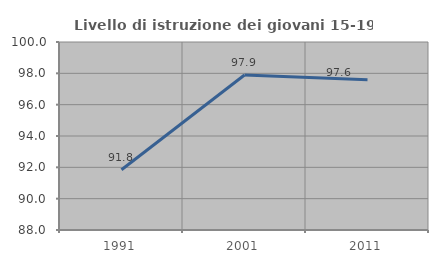
| Category | Livello di istruzione dei giovani 15-19 anni |
|---|---|
| 1991.0 | 91.847 |
| 2001.0 | 97.89 |
| 2011.0 | 97.588 |